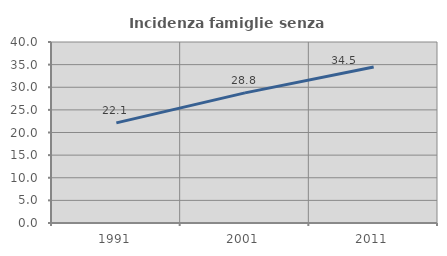
| Category | Incidenza famiglie senza nuclei |
|---|---|
| 1991.0 | 22.13 |
| 2001.0 | 28.752 |
| 2011.0 | 34.474 |